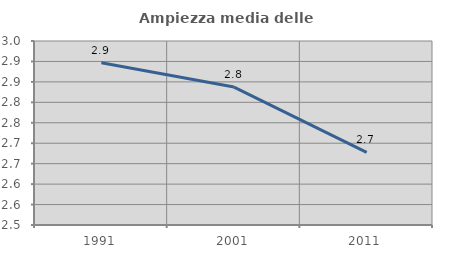
| Category | Ampiezza media delle famiglie |
|---|---|
| 1991.0 | 2.897 |
| 2001.0 | 2.837 |
| 2011.0 | 2.678 |